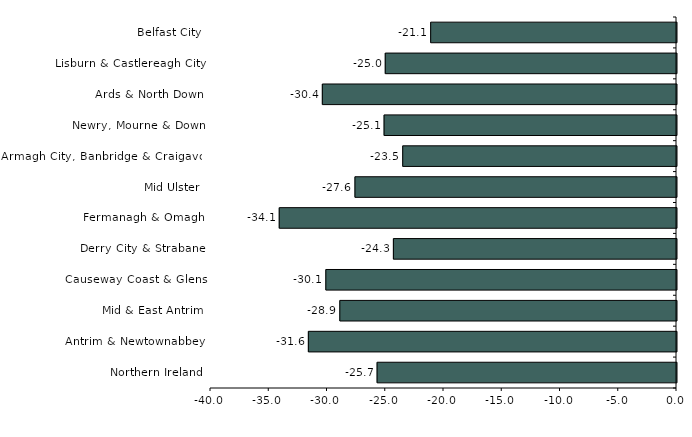
| Category | Series 0 |
|---|---|
| Belfast City | -21.1 |
| Lisburn & Castlereagh City | -25 |
| Ards & North Down | -30.4 |
| Newry, Mourne & Down | -25.1 |
| Armagh City, Banbridge & Craigavon | -23.5 |
| Mid Ulster | -27.6 |
| Fermanagh & Omagh | -34.1 |
| Derry City & Strabane | -24.3 |
| Causeway Coast & Glens | -30.1 |
| Mid & East Antrim | -28.9 |
| Antrim & Newtownabbey | -31.6 |
| Northern Ireland | -25.7 |